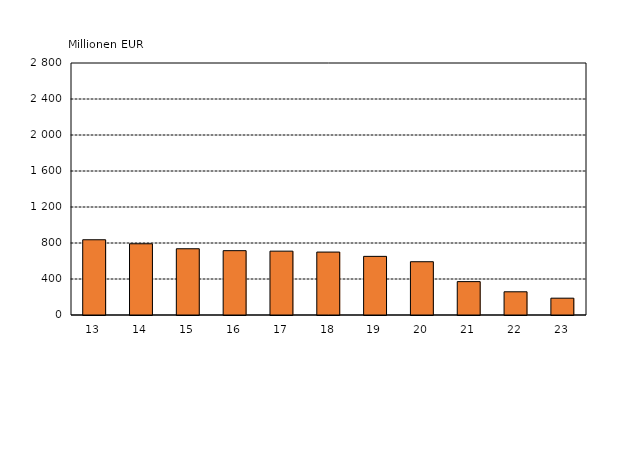
| Category | Series 0 |
|---|---|
| 13 | 836.093 |
| 14 | 791.424 |
| 15 | 735.984 |
| 16 | 714.876 |
| 17 | 709.456 |
| 18 | 699.282 |
| 19 | 651.555 |
| 20 | 591.985 |
| 21 | 370.99 |
| 22 | 257.822 |
| 23 | 186.951 |